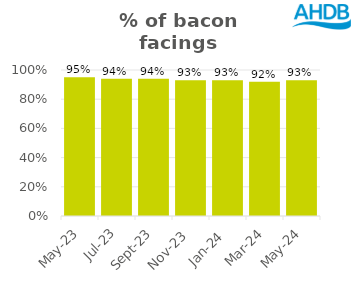
| Category | Bacon |
|---|---|
| 2023-05-01 | 0.95 |
| 2023-07-01 | 0.94 |
| 2023-09-01 | 0.94 |
| 2023-11-01 | 0.93 |
| 2024-01-01 | 0.93 |
| 2024-03-01 | 0.92 |
| 2024-05-01 | 0.93 |